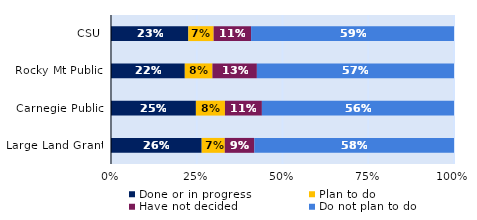
| Category | Done or in progress | Plan to do | Have not decided | Do not plan to do |
|---|---|---|---|---|
| CSU | 0.225 | 0.074 | 0.109 | 0.592 |
| Rocky Mt Public | 0.215 | 0.081 | 0.13 | 0.575 |
| Carnegie Public | 0.248 | 0.085 | 0.108 | 0.56 |
| Large Land Grant | 0.264 | 0.067 | 0.086 | 0.582 |